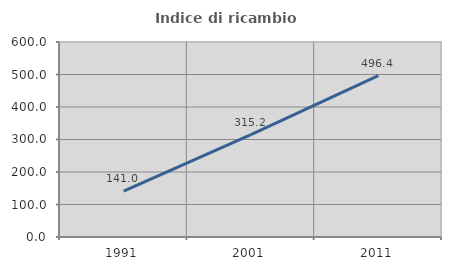
| Category | Indice di ricambio occupazionale  |
|---|---|
| 1991.0 | 140.964 |
| 2001.0 | 315.152 |
| 2011.0 | 496.364 |